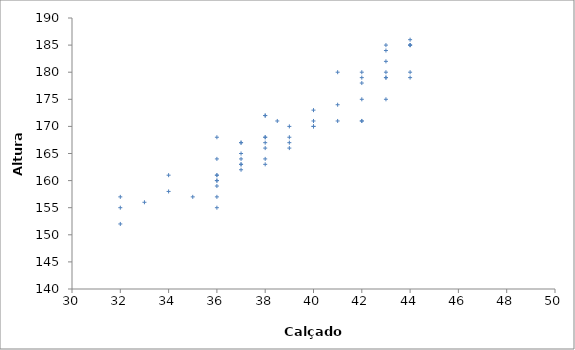
| Category | Altura |
|---|---|
| 32.0 | 152 |
| 32.0 | 155 |
| 36.0 | 155 |
| 33.0 | 156 |
| 32.0 | 157 |
| 35.0 | 157 |
| 36.0 | 157 |
| 34.0 | 158 |
| 36.0 | 159 |
| 36.0 | 160 |
| 36.0 | 160 |
| 34.0 | 161 |
| 36.0 | 161 |
| 36.0 | 161 |
| 37.0 | 162 |
| 37.0 | 163 |
| 37.0 | 163 |
| 38.0 | 163 |
| 38.0 | 164 |
| 36.0 | 164 |
| 37.0 | 164 |
| 37.0 | 165 |
| 38.0 | 166 |
| 39.0 | 166 |
| 37.0 | 167 |
| 39.0 | 167 |
| 37.0 | 167 |
| 38.0 | 167 |
| 36.0 | 168 |
| 38.0 | 168 |
| 39.0 | 168 |
| 38.0 | 168 |
| 39.0 | 170 |
| 40.0 | 170 |
| 40.0 | 170 |
| 38.5 | 171 |
| 41.0 | 171 |
| 42.0 | 171 |
| 42.0 | 171 |
| 40.0 | 171 |
| 38.0 | 172 |
| 38.0 | 172 |
| 40.0 | 173 |
| 41.0 | 174 |
| 43.0 | 175 |
| 42.0 | 175 |
| 42.0 | 178 |
| 42.0 | 179 |
| 43.0 | 179 |
| 43.0 | 179 |
| 44.0 | 179 |
| 41.0 | 180 |
| 42.0 | 180 |
| 43.0 | 180 |
| 44.0 | 180 |
| 43.0 | 182 |
| 43.0 | 184 |
| 43.0 | 185 |
| 44.0 | 185 |
| 44.0 | 185 |
| 44.0 | 185 |
| 44.0 | 186 |